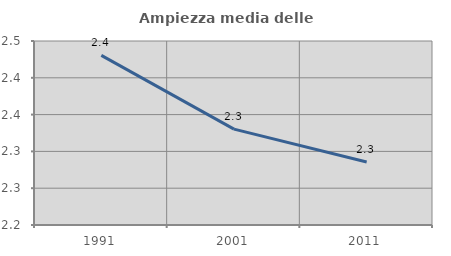
| Category | Ampiezza media delle famiglie |
|---|---|
| 1991.0 | 2.43 |
| 2001.0 | 2.33 |
| 2011.0 | 2.286 |